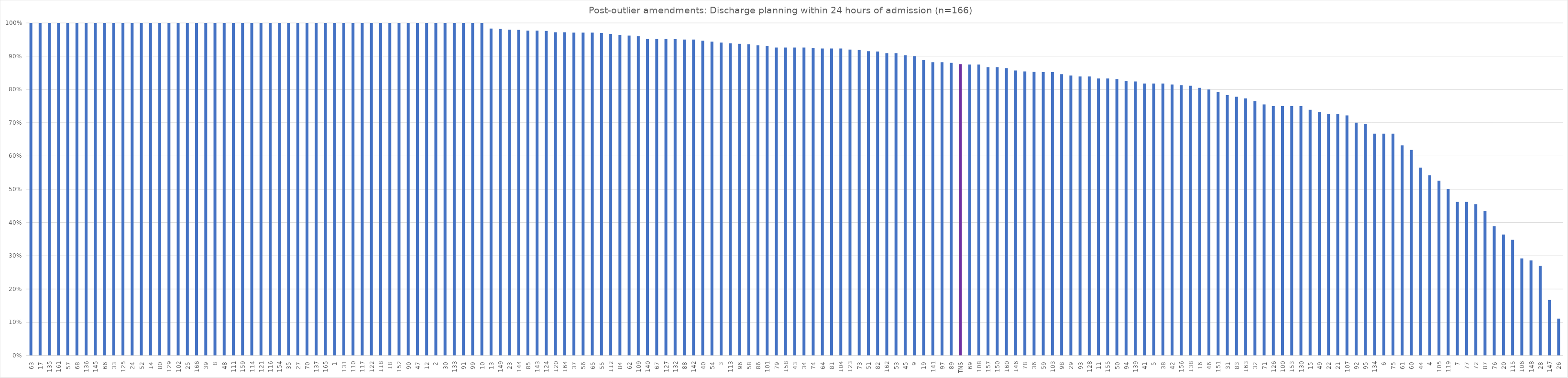
| Category | Series 0 |
|---|---|
| 63 | 1 |
| 17 | 1 |
| 135 | 1 |
| 161 | 1 |
| 57 | 1 |
| 68 | 1 |
| 136 | 1 |
| 145 | 1 |
| 66 | 1 |
| 33 | 1 |
| 125 | 1 |
| 24 | 1 |
| 52 | 1 |
| 14 | 1 |
| 80 | 1 |
| 129 | 1 |
| 102 | 1 |
| 25 | 1 |
| 166 | 1 |
| 39 | 1 |
| 8 | 1 |
| 48 | 1 |
| 111 | 1 |
| 159 | 1 |
| 114 | 1 |
| 121 | 1 |
| 116 | 1 |
| 154 | 1 |
| 35 | 1 |
| 27 | 1 |
| 70 | 1 |
| 137 | 1 |
| 165 | 1 |
| 1 | 1 |
| 131 | 1 |
| 110 | 1 |
| 117 | 1 |
| 122 | 1 |
| 118 | 1 |
| 18 | 1 |
| 152 | 1 |
| 90 | 1 |
| 47 | 1 |
| 12 | 1 |
| 2 | 1 |
| 30 | 1 |
| 133 | 1 |
| 91 | 1 |
| 99 | 1 |
| 10 | 1 |
| 13 | 0.983 |
| 149 | 0.982 |
| 23 | 0.98 |
| 144 | 0.979 |
| 85 | 0.977 |
| 143 | 0.977 |
| 124 | 0.976 |
| 120 | 0.972 |
| 164 | 0.972 |
| 37 | 0.971 |
| 56 | 0.971 |
| 65 | 0.971 |
| 55 | 0.97 |
| 112 | 0.967 |
| 84 | 0.964 |
| 62 | 0.962 |
| 109 | 0.96 |
| 140 | 0.952 |
| 67 | 0.952 |
| 127 | 0.952 |
| 132 | 0.951 |
| 88 | 0.95 |
| 142 | 0.95 |
| 40 | 0.947 |
| 54 | 0.944 |
| 3 | 0.941 |
| 113 | 0.939 |
| 96 | 0.937 |
| 58 | 0.936 |
| 86 | 0.933 |
| 101 | 0.931 |
| 79 | 0.926 |
| 158 | 0.926 |
| 43 | 0.926 |
| 34 | 0.926 |
| 74 | 0.925 |
| 64 | 0.923 |
| 81 | 0.923 |
| 104 | 0.923 |
| 123 | 0.92 |
| 73 | 0.919 |
| 51 | 0.915 |
| 82 | 0.914 |
| 162 | 0.909 |
| 53 | 0.909 |
| 45 | 0.903 |
| 9 | 0.9 |
| 19 | 0.889 |
| 141 | 0.882 |
| 97 | 0.882 |
| 89 | 0.88 |
| TNS | 0.876 |
| 69 | 0.875 |
| 108 | 0.875 |
| 157 | 0.867 |
| 150 | 0.867 |
| 160 | 0.864 |
| 146 | 0.857 |
| 78 | 0.854 |
| 36 | 0.853 |
| 59 | 0.852 |
| 103 | 0.852 |
| 98 | 0.846 |
| 29 | 0.842 |
| 93 | 0.839 |
| 128 | 0.839 |
| 11 | 0.833 |
| 155 | 0.833 |
| 50 | 0.831 |
| 94 | 0.826 |
| 139 | 0.824 |
| 41 | 0.818 |
| 5 | 0.818 |
| 38 | 0.818 |
| 42 | 0.815 |
| 156 | 0.813 |
| 138 | 0.811 |
| 16 | 0.805 |
| 46 | 0.8 |
| 151 | 0.792 |
| 31 | 0.783 |
| 83 | 0.778 |
| 163 | 0.773 |
| 32 | 0.765 |
| 71 | 0.755 |
| 126 | 0.75 |
| 100 | 0.75 |
| 153 | 0.75 |
| 130 | 0.75 |
| 15 | 0.739 |
| 49 | 0.732 |
| 22 | 0.727 |
| 21 | 0.727 |
| 107 | 0.722 |
| 92 | 0.7 |
| 95 | 0.696 |
| 134 | 0.667 |
| 6 | 0.667 |
| 75 | 0.667 |
| 61 | 0.632 |
| 60 | 0.618 |
| 44 | 0.565 |
| 4 | 0.542 |
| 105 | 0.526 |
| 119 | 0.5 |
| 7 | 0.462 |
| 77 | 0.462 |
| 72 | 0.455 |
| 87 | 0.435 |
| 76 | 0.389 |
| 20 | 0.364 |
| 115 | 0.348 |
| 106 | 0.292 |
| 148 | 0.286 |
| 28 | 0.27 |
| 147 | 0.167 |
| 26 | 0.111 |